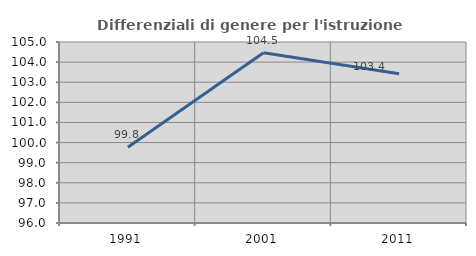
| Category | Differenziali di genere per l'istruzione superiore |
|---|---|
| 1991.0 | 99.772 |
| 2001.0 | 104.463 |
| 2011.0 | 103.423 |